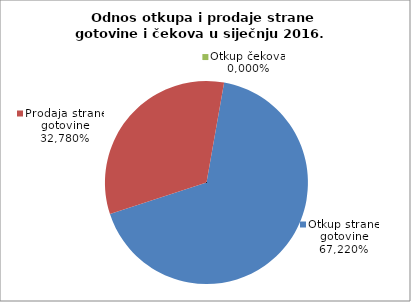
| Category | Otkup strane gotovine |
|---|---|
| 0 | 0.672 |
| 1 | 0.328 |
| 2 | 0 |